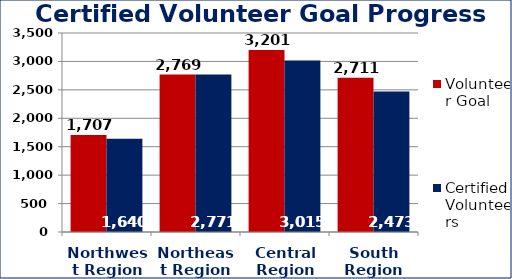
| Category | Volunteer Goal  | Certified Volunteers  |
|---|---|---|
| Northwest Region | 1707 | 1640 |
| Northeast Region | 2769 | 2771 |
| Central Region | 3201 | 3015 |
| South Region | 2711 | 2473 |